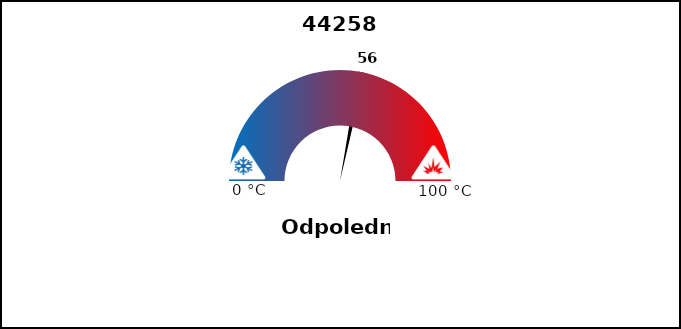
| Category | Series 1 |
|---|---|
| 0 | 55 |
| 1 | 2 |
| 2 | 142 |